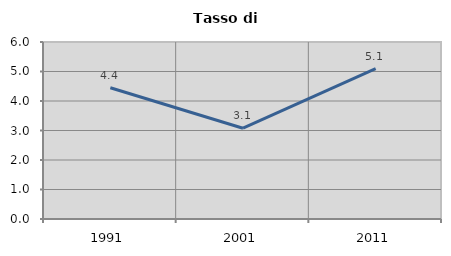
| Category | Tasso di disoccupazione   |
|---|---|
| 1991.0 | 4.448 |
| 2001.0 | 3.077 |
| 2011.0 | 5.096 |